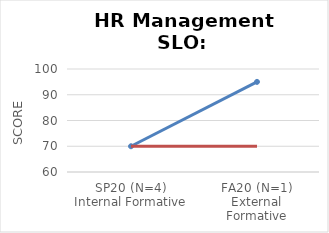
| Category | Series 0 | Series 1 |
|---|---|---|
| SP20 (N=4)
Internal Formative | 70 | 70 |
| FA20 (N=1)
External
Formative | 95 | 70 |